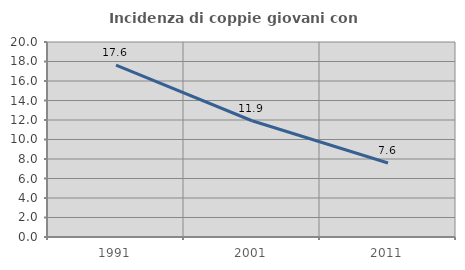
| Category | Incidenza di coppie giovani con figli |
|---|---|
| 1991.0 | 17.639 |
| 2001.0 | 11.924 |
| 2011.0 | 7.593 |